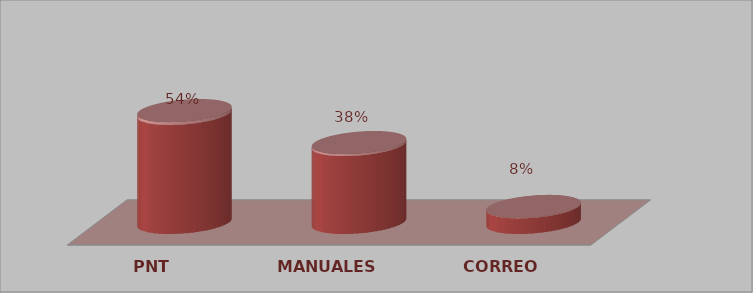
| Category | Series 0 | Series 1 |
|---|---|---|
| PNT | 21 | 0.538 |
| MANUALES | 15 | 0.385 |
| CORREO | 3 | 0.077 |